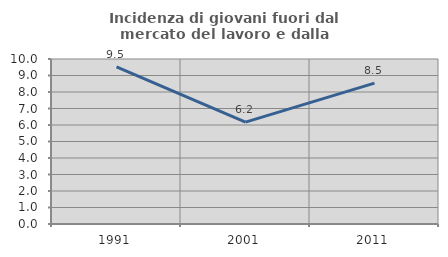
| Category | Incidenza di giovani fuori dal mercato del lavoro e dalla formazione  |
|---|---|
| 1991.0 | 9.517 |
| 2001.0 | 6.175 |
| 2011.0 | 8.539 |